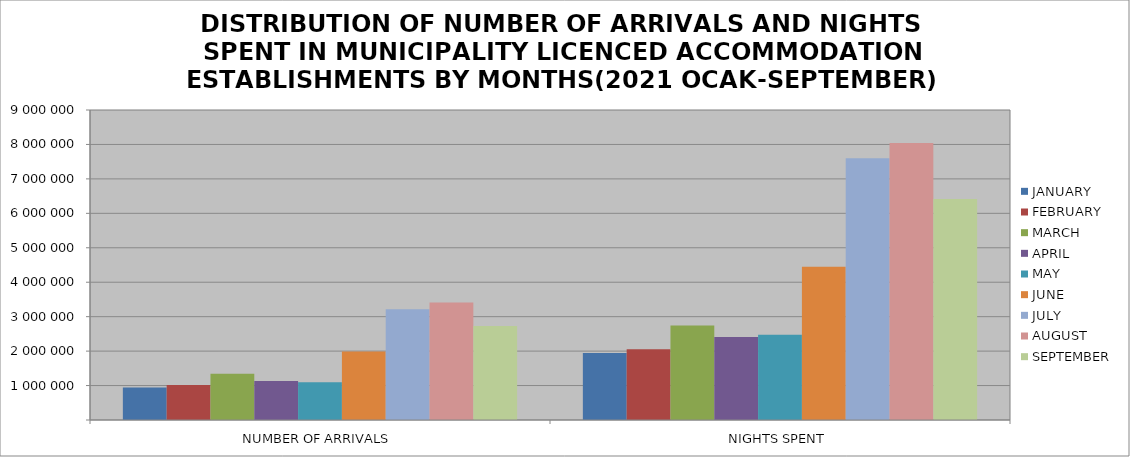
| Category | JANUARY | FEBRUARY | MARCH | APRIL | MAY | JUNE | JULY | AUGUST | SEPTEMBER |
|---|---|---|---|---|---|---|---|---|---|
| NUMBER OF ARRIVALS | 940331 | 1017199 | 1342202 | 1131069 | 1098456 | 1989433 | 3215014 | 3414690 | 2728285 |
| NIGHTS SPENT | 1943007 | 2056594 | 2743257 | 2406723 | 2471826 | 4450821 | 7597288 | 8039529 | 6417353 |